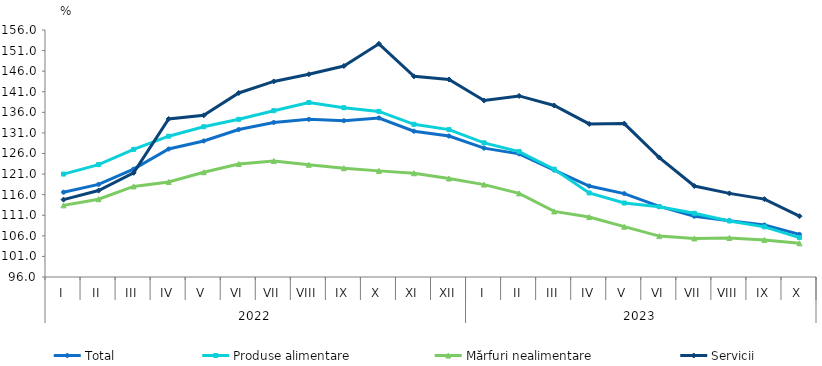
| Category | Total  | Produse alimentare | Mărfuri nealimentare  | Servicii |
|---|---|---|---|---|
| 0 | 116.6 | 121 | 113.4 | 114.8 |
| 1 | 118.5 | 123.3 | 114.9 | 117 |
| 2 | 122.2 | 127 | 118 | 121.3 |
| 3 | 127.1 | 130.2 | 119.1 | 134.4 |
| 4 | 129.047 | 132.5 | 121.45 | 135.267 |
| 5 | 131.827 | 134.301 | 123.443 | 140.701 |
| 6 | 133.547 | 136.399 | 124.168 | 143.511 |
| 7 | 134.294 | 138.387 | 123.256 | 145.253 |
| 8 | 133.971 | 137.121 | 122.424 | 147.248 |
| 9 | 134.625 | 136.226 | 121.779 | 152.646 |
| 10 | 131.406 | 133.093 | 121.201 | 144.742 |
| 11 | 130.241 | 131.801 | 119.936 | 143.965 |
| 12 | 127.307 | 128.59 | 118.441 | 138.865 |
| 13 | 125.91 | 126.47 | 116.31 | 139.99 |
| 14 | 121.977 | 122.19 | 111.932 | 137.666 |
| 15 | 118.102 | 116.414 | 110.554 | 133.178 |
| 16 | 116.262 | 113.97 | 108.228 | 133.268 |
| 17 | 113.152 | 113.076 | 105.931 | 125.017 |
| 18 | 110.755 | 111.48 | 105.365 | 118.101 |
| 19 | 109.689 | 109.605 | 105.486 | 116.313 |
| 20 | 108.634 | 108.179 | 105.004 | 114.916 |
| 21 | 106.342 | 105.575 | 104.182 | 110.77 |